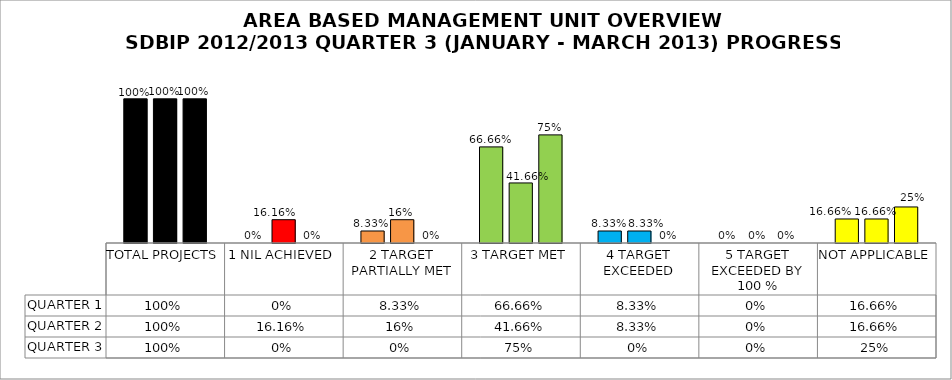
| Category | QUARTER 1 | QUARTER 2 | QUARTER 3 |
|---|---|---|---|
| TOTAL PROJECTS | 1 | 1 | 1 |
| 1 NIL ACHIEVED | 0 | 0.162 | 0 |
| 2 TARGET PARTIALLY MET | 0.083 | 0.162 | 0 |
| 3 TARGET MET | 0.667 | 0.417 | 0.75 |
| 4 TARGET EXCEEDED | 0.083 | 0.083 | 0 |
| 5 TARGET EXCEEDED BY 100 % | 0 | 0 | 0 |
| NOT APPLICABLE | 0.167 | 0.167 | 0.25 |